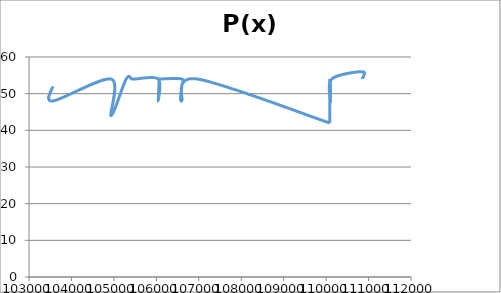
| Category | Series 0 |
|---|---|
| 103562.0 | 52 |
| 103562.0 | 48 |
| 104934.0 | 54 |
| 104934.0 | 44 |
| 105289.0 | 54 |
| 105422.0 | 54 |
| 105498.0 | 54 |
| 106044.0 | 54 |
| 106044.0 | 48 |
| 106066.0 | 54 |
| 106088.0 | 54 |
| 106598.0 | 54 |
| 106598.0 | 52 |
| 106598.0 | 48 |
| 106967.0 | 54 |
| 110085.0 | 42 |
| 110091.0 | 54 |
| 110104.0 | 52 |
| 110104.0 | 50 |
| 110104.0 | 48 |
| 110132.0 | 54 |
| 110852.0 | 56 |
| 110852.0 | 54 |